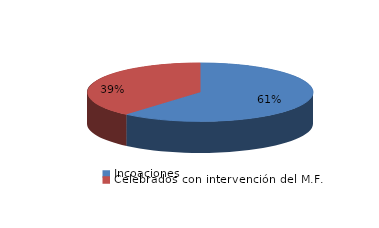
| Category | Series 0 |
|---|---|
| Incoaciones | 1600 |
| Celebrados con intervención del M.F. | 1013 |